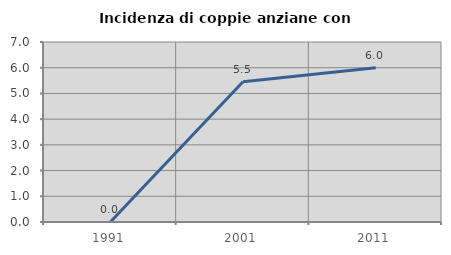
| Category | Incidenza di coppie anziane con figli |
|---|---|
| 1991.0 | 0 |
| 2001.0 | 5.455 |
| 2011.0 | 6 |